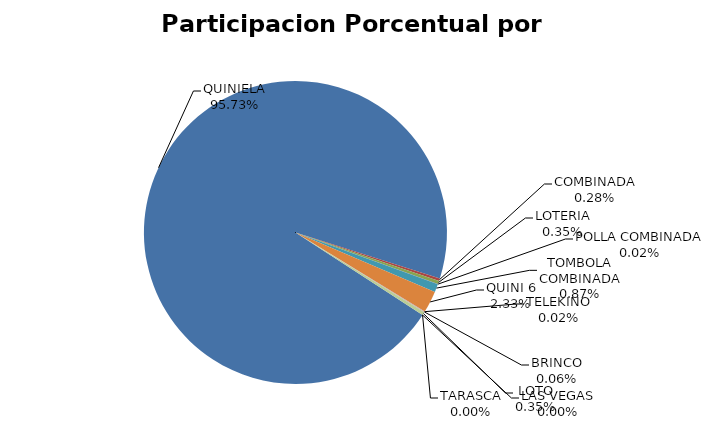
| Category | Series 0 |
|---|---|
| QUINIELA | 88821405.31 |
| COMBINADA | 256705.65 |
| LOTERIA | 323259.95 |
| POLLA COMBINADA | 22212 |
| TOMBOLA COMBINADA | 803546 |
| QUINI 6 | 2157226.96 |
| TELEKINO | 19383 |
| BRINCO | 53346.26 |
| LOTO | 322200 |
| TARASCA | 0 |
| LAS VEGAS | 0 |